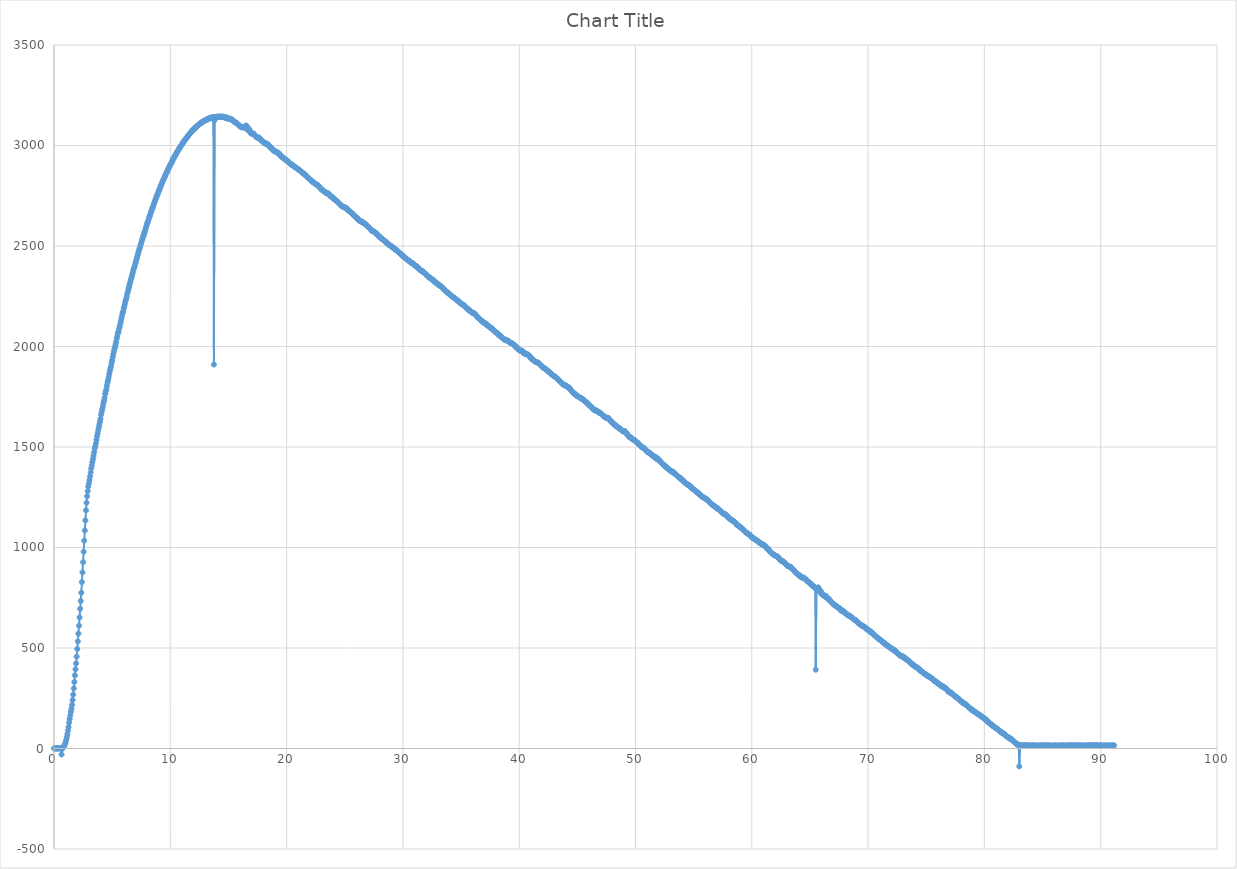
| Category | Series 0 |
|---|---|
| 0.0 | 1 |
| 0.05 | 0 |
| 0.1 | 0 |
| 0.15 | 2 |
| 0.2 | 0 |
| 0.25 | 0 |
| 0.3 | 1 |
| 0.35 | 0 |
| 0.4 | 1 |
| 0.45 | 1 |
| 0.5 | 1 |
| 0.55 | 2 |
| 0.6 | 0 |
| 0.65 | -30 |
| 0.7 | -2 |
| 0.75 | 2 |
| 0.8 | 6 |
| 0.85 | 10 |
| 0.9 | 16 |
| 0.95 | 22 |
| 1.0 | 31 |
| 1.05 | 42 |
| 1.1 | 56 |
| 1.15 | 71 |
| 1.2 | 89 |
| 1.25 | 107 |
| 1.3 | 129 |
| 1.35 | 147 |
| 1.4 | 164 |
| 1.45 | 182 |
| 1.5 | 198 |
| 1.55 | 217 |
| 1.6 | 241 |
| 1.65 | 268 |
| 1.7 | 299 |
| 1.75 | 331 |
| 1.8 | 364 |
| 1.85 | 394 |
| 1.9 | 423 |
| 1.95 | 457 |
| 2.0 | 495 |
| 2.05 | 533 |
| 2.1 | 572 |
| 2.15 | 611 |
| 2.2 | 652 |
| 2.25 | 695 |
| 2.3 | 734 |
| 2.35 | 775 |
| 2.4 | 828 |
| 2.45 | 876 |
| 2.5 | 927 |
| 2.55 | 979 |
| 2.6 | 1034 |
| 2.65 | 1085 |
| 2.7 | 1135 |
| 2.75 | 1185 |
| 2.8 | 1223 |
| 2.85 | 1255 |
| 2.9 | 1280 |
| 2.95 | 1303 |
| 3.0 | 1320 |
| 3.05 | 1336 |
| 3.1 | 1355 |
| 3.15 | 1374 |
| 3.2 | 1393 |
| 3.25 | 1409 |
| 3.3 | 1425 |
| 3.35 | 1440 |
| 3.4 | 1457 |
| 3.45 | 1474 |
| 3.5 | 1492 |
| 3.55 | 1504 |
| 3.6 | 1518 |
| 3.65 | 1535 |
| 3.7 | 1553 |
| 3.75 | 1567 |
| 3.8 | 1583 |
| 3.85 | 1597 |
| 3.9 | 1611 |
| 3.95 | 1625 |
| 4.0 | 1640 |
| 4.05 | 1660 |
| 4.1 | 1675 |
| 4.15 | 1689 |
| 4.2 | 1703 |
| 4.25 | 1719 |
| 4.3 | 1730 |
| 4.35 | 1744 |
| 4.4 | 1764 |
| 4.45 | 1777 |
| 4.5 | 1787 |
| 4.55 | 1805 |
| 4.6 | 1821 |
| 4.65 | 1833 |
| 4.7 | 1847 |
| 4.75 | 1863 |
| 4.8 | 1878 |
| 4.85 | 1891 |
| 4.9 | 1902 |
| 4.95 | 1918 |
| 5.0 | 1931 |
| 5.05 | 1947 |
| 5.1 | 1962 |
| 5.15 | 1976 |
| 5.2 | 1988 |
| 5.25 | 1998 |
| 5.3 | 2011 |
| 5.35 | 2024 |
| 5.4 | 2041 |
| 5.45 | 2053 |
| 5.5 | 2067 |
| 5.55 | 2074 |
| 5.6 | 2089 |
| 5.65 | 2100 |
| 5.7 | 2112 |
| 5.75 | 2126 |
| 5.8 | 2140 |
| 5.85 | 2154 |
| 5.9 | 2167 |
| 5.95 | 2175 |
| 6.0 | 2189 |
| 6.05 | 2200 |
| 6.1 | 2214 |
| 6.15 | 2227 |
| 6.2 | 2236 |
| 6.25 | 2248 |
| 6.3 | 2263 |
| 6.35 | 2273 |
| 6.4 | 2285 |
| 6.45 | 2296 |
| 6.5 | 2308 |
| 6.55 | 2318 |
| 6.6 | 2331 |
| 6.65 | 2341 |
| 6.7 | 2351 |
| 6.75 | 2363 |
| 6.8 | 2374 |
| 6.85 | 2385 |
| 6.9 | 2393 |
| 6.95 | 2403 |
| 7.0 | 2415 |
| 7.05 | 2424 |
| 7.1 | 2435 |
| 7.15 | 2445 |
| 7.2 | 2456 |
| 7.25 | 2467 |
| 7.3 | 2477 |
| 7.35 | 2486 |
| 7.4 | 2495 |
| 7.45 | 2505 |
| 7.5 | 2515 |
| 7.55 | 2526 |
| 7.6 | 2535 |
| 7.65 | 2545 |
| 7.7 | 2552 |
| 7.75 | 2561 |
| 7.8 | 2570 |
| 7.85 | 2580 |
| 7.9 | 2591 |
| 7.95 | 2600 |
| 8.0 | 2610 |
| 8.05 | 2618 |
| 8.1 | 2625 |
| 8.15 | 2635 |
| 8.2 | 2645 |
| 8.25 | 2651 |
| 8.3 | 2662 |
| 8.35 | 2670 |
| 8.4 | 2678 |
| 8.45 | 2687 |
| 8.5 | 2693 |
| 8.55 | 2703 |
| 8.6 | 2711 |
| 8.65 | 2719 |
| 8.7 | 2726 |
| 8.75 | 2734 |
| 8.8 | 2744 |
| 8.85 | 2750 |
| 8.9 | 2756 |
| 8.95 | 2764 |
| 9.0 | 2772 |
| 9.05 | 2779 |
| 9.1 | 2786 |
| 9.15 | 2795 |
| 9.2 | 2801 |
| 9.25 | 2808 |
| 9.3 | 2815 |
| 9.35 | 2823 |
| 9.4 | 2828 |
| 9.45 | 2835 |
| 9.5 | 2842 |
| 9.55 | 2848 |
| 9.6 | 2856 |
| 9.65 | 2861 |
| 9.7 | 2868 |
| 9.75 | 2873 |
| 9.8 | 2879 |
| 9.85 | 2886 |
| 9.9 | 2893 |
| 9.95 | 2897 |
| 10.0 | 2904 |
| 10.05 | 2908 |
| 10.1 | 2914 |
| 10.15 | 2920 |
| 10.2 | 2927 |
| 10.25 | 2933 |
| 10.3 | 2937 |
| 10.35 | 2943 |
| 10.4 | 2949 |
| 10.45 | 2953 |
| 10.5 | 2957 |
| 10.55 | 2964 |
| 10.6 | 2969 |
| 10.65 | 2973 |
| 10.7 | 2978 |
| 10.75 | 2984 |
| 10.8 | 2987 |
| 10.85 | 2992 |
| 10.9 | 2997 |
| 10.95 | 3001 |
| 11.0 | 3006 |
| 11.05 | 3009 |
| 11.1 | 3015 |
| 11.15 | 3020 |
| 11.2 | 3023 |
| 11.25 | 3026 |
| 11.3 | 3031 |
| 11.35 | 3035 |
| 11.4 | 3039 |
| 11.45 | 3041 |
| 11.5 | 3046 |
| 11.55 | 3050 |
| 11.6 | 3054 |
| 11.65 | 3057 |
| 11.7 | 3061 |
| 11.75 | 3065 |
| 11.8 | 3067 |
| 11.85 | 3070 |
| 11.9 | 3074 |
| 11.95 | 3078 |
| 12.0 | 3081 |
| 12.05 | 3081 |
| 12.1 | 3086 |
| 12.15 | 3089 |
| 12.2 | 3091 |
| 12.25 | 3094 |
| 12.3 | 3096 |
| 12.35 | 3099 |
| 12.4 | 3102 |
| 12.45 | 3103 |
| 12.5 | 3107 |
| 12.55 | 3107 |
| 12.6 | 3111 |
| 12.65 | 3114 |
| 12.7 | 3115 |
| 12.75 | 3116 |
| 12.8 | 3119 |
| 12.85 | 3120 |
| 12.9 | 3123 |
| 12.95 | 3123 |
| 13.0 | 3126 |
| 13.05 | 3127 |
| 13.1 | 3128 |
| 13.15 | 3130 |
| 13.2 | 3130 |
| 13.25 | 3132 |
| 13.3 | 3135 |
| 13.35 | 3135 |
| 13.4 | 3135 |
| 13.45 | 3138 |
| 13.5 | 3138 |
| 13.55 | 3139 |
| 13.6 | 3140 |
| 13.65 | 3139 |
| 13.7 | 3140 |
| 13.75 | 1910 |
| 13.8 | 3125 |
| 13.85 | 3142 |
| 13.9 | 3141 |
| 13.95 | 3141 |
| 14.0 | 3143 |
| 14.05 | 3143 |
| 14.1 | 3144 |
| 14.15 | 3143 |
| 14.2 | 3142 |
| 14.25 | 3142 |
| 14.3 | 3143 |
| 14.35 | 3145 |
| 14.4 | 3141 |
| 14.45 | 3142 |
| 14.5 | 3143 |
| 14.55 | 3143 |
| 14.6 | 3141 |
| 14.65 | 3140 |
| 14.7 | 3140 |
| 14.75 | 3138 |
| 14.8 | 3138 |
| 14.85 | 3140 |
| 14.9 | 3134 |
| 14.95 | 3137 |
| 15.0 | 3134 |
| 15.05 | 3133 |
| 15.1 | 3132 |
| 15.15 | 3133 |
| 15.2 | 3131 |
| 15.25 | 3131 |
| 15.3 | 3127 |
| 15.35 | 3126 |
| 15.4 | 3123 |
| 15.45 | 3121 |
| 15.5 | 3119 |
| 15.55 | 3117 |
| 15.6 | 3114 |
| 15.65 | 3114 |
| 15.7 | 3112 |
| 15.75 | 3108 |
| 15.8 | 3106 |
| 15.85 | 3103 |
| 15.9 | 3102 |
| 15.95 | 3098 |
| 16.0 | 3096 |
| 16.05 | 3094 |
| 16.1 | 3091 |
| 16.15 | 3093 |
| 16.2 | 3091 |
| 16.25 | 3091 |
| 16.3 | 3089 |
| 16.35 | 3090 |
| 16.4 | 3089 |
| 16.45 | 3094 |
| 16.5 | 3099 |
| 16.55 | 3097 |
| 16.6 | 3089 |
| 16.65 | 3077 |
| 16.7 | 3086 |
| 16.75 | 3081 |
| 16.8 | 3080 |
| 16.85 | 3069 |
| 16.9 | 3063 |
| 16.95 | 3061 |
| 17.0 | 3060 |
| 17.05 | 3057 |
| 17.1 | 3059 |
| 17.15 | 3060 |
| 17.2 | 3056 |
| 17.25 | 3052 |
| 17.3 | 3047 |
| 17.35 | 3046 |
| 17.4 | 3041 |
| 17.45 | 3040 |
| 17.5 | 3041 |
| 17.55 | 3041 |
| 17.6 | 3038 |
| 17.65 | 3036 |
| 17.7 | 3035 |
| 17.75 | 3030 |
| 17.8 | 3026 |
| 17.85 | 3024 |
| 17.9 | 3023 |
| 17.95 | 3020 |
| 18.0 | 3017 |
| 18.05 | 3014 |
| 18.1 | 3011 |
| 18.15 | 3010 |
| 18.2 | 3010 |
| 18.25 | 3010 |
| 18.3 | 3008 |
| 18.35 | 3006 |
| 18.4 | 3006 |
| 18.45 | 3002 |
| 18.5 | 2998 |
| 18.55 | 2993 |
| 18.6 | 2992 |
| 18.65 | 2988 |
| 18.7 | 2986 |
| 18.75 | 2983 |
| 18.8 | 2980 |
| 18.85 | 2976 |
| 18.9 | 2974 |
| 18.95 | 2973 |
| 19.0 | 2970 |
| 19.05 | 2969 |
| 19.1 | 2970 |
| 19.15 | 2967 |
| 19.2 | 2965 |
| 19.25 | 2963 |
| 19.3 | 2964 |
| 19.35 | 2958 |
| 19.4 | 2957 |
| 19.45 | 2951 |
| 19.5 | 2950 |
| 19.55 | 2946 |
| 19.6 | 2943 |
| 19.65 | 2940 |
| 19.7 | 2938 |
| 19.75 | 2937 |
| 19.8 | 2935 |
| 19.85 | 2932 |
| 19.9 | 2930 |
| 19.95 | 2928 |
| 20.0 | 2925 |
| 20.05 | 2924 |
| 20.1 | 2920 |
| 20.15 | 2920 |
| 20.2 | 2916 |
| 20.25 | 2912 |
| 20.3 | 2910 |
| 20.35 | 2908 |
| 20.4 | 2906 |
| 20.45 | 2903 |
| 20.5 | 2902 |
| 20.55 | 2901 |
| 20.6 | 2897 |
| 20.65 | 2896 |
| 20.7 | 2894 |
| 20.75 | 2892 |
| 20.8 | 2890 |
| 20.85 | 2888 |
| 20.9 | 2886 |
| 20.95 | 2883 |
| 21.0 | 2881 |
| 21.05 | 2880 |
| 21.1 | 2878 |
| 21.15 | 2875 |
| 21.2 | 2874 |
| 21.25 | 2870 |
| 21.3 | 2867 |
| 21.35 | 2865 |
| 21.4 | 2863 |
| 21.45 | 2861 |
| 21.5 | 2859 |
| 21.55 | 2856 |
| 21.6 | 2854 |
| 21.65 | 2850 |
| 21.7 | 2848 |
| 21.75 | 2845 |
| 21.8 | 2843 |
| 21.85 | 2839 |
| 21.9 | 2837 |
| 21.95 | 2834 |
| 22.0 | 2832 |
| 22.05 | 2829 |
| 22.1 | 2828 |
| 22.15 | 2824 |
| 22.2 | 2821 |
| 22.25 | 2818 |
| 22.3 | 2817 |
| 22.35 | 2815 |
| 22.4 | 2812 |
| 22.45 | 2811 |
| 22.5 | 2808 |
| 22.55 | 2805 |
| 22.6 | 2804 |
| 22.65 | 2804 |
| 22.7 | 2802 |
| 22.75 | 2798 |
| 22.8 | 2794 |
| 22.85 | 2791 |
| 22.9 | 2788 |
| 22.95 | 2785 |
| 23.0 | 2781 |
| 23.05 | 2779 |
| 23.1 | 2778 |
| 23.15 | 2776 |
| 23.2 | 2772 |
| 23.25 | 2771 |
| 23.3 | 2768 |
| 23.35 | 2766 |
| 23.4 | 2765 |
| 23.45 | 2763 |
| 23.5 | 2761 |
| 23.55 | 2763 |
| 23.6 | 2760 |
| 23.65 | 2758 |
| 23.7 | 2753 |
| 23.75 | 2748 |
| 23.8 | 2748 |
| 23.85 | 2746 |
| 23.9 | 2744 |
| 23.95 | 2742 |
| 24.0 | 2738 |
| 24.05 | 2737 |
| 24.1 | 2732 |
| 24.15 | 2730 |
| 24.2 | 2728 |
| 24.25 | 2727 |
| 24.3 | 2724 |
| 24.35 | 2722 |
| 24.4 | 2718 |
| 24.45 | 2714 |
| 24.5 | 2713 |
| 24.55 | 2710 |
| 24.6 | 2707 |
| 24.65 | 2703 |
| 24.7 | 2701 |
| 24.75 | 2700 |
| 24.8 | 2697 |
| 24.85 | 2695 |
| 24.9 | 2693 |
| 24.95 | 2694 |
| 25.0 | 2692 |
| 25.05 | 2691 |
| 25.1 | 2690 |
| 25.15 | 2688 |
| 25.2 | 2683 |
| 25.25 | 2681 |
| 25.3 | 2678 |
| 25.35 | 2675 |
| 25.4 | 2674 |
| 25.45 | 2672 |
| 25.5 | 2668 |
| 25.55 | 2666 |
| 25.6 | 2662 |
| 25.65 | 2662 |
| 25.7 | 2658 |
| 25.75 | 2657 |
| 25.8 | 2651 |
| 25.85 | 2648 |
| 25.9 | 2647 |
| 25.95 | 2644 |
| 26.0 | 2642 |
| 26.05 | 2641 |
| 26.1 | 2635 |
| 26.15 | 2633 |
| 26.2 | 2629 |
| 26.25 | 2628 |
| 26.3 | 2625 |
| 26.35 | 2623 |
| 26.4 | 2623 |
| 26.45 | 2620 |
| 26.5 | 2620 |
| 26.55 | 2620 |
| 26.6 | 2614 |
| 26.65 | 2613 |
| 26.7 | 2612 |
| 26.75 | 2609 |
| 26.8 | 2608 |
| 26.85 | 2606 |
| 26.9 | 2603 |
| 26.95 | 2598 |
| 27.0 | 2596 |
| 27.05 | 2594 |
| 27.1 | 2592 |
| 27.15 | 2588 |
| 27.2 | 2584 |
| 27.25 | 2582 |
| 27.3 | 2577 |
| 27.35 | 2576 |
| 27.4 | 2574 |
| 27.45 | 2574 |
| 27.5 | 2572 |
| 27.55 | 2569 |
| 27.6 | 2568 |
| 27.65 | 2566 |
| 27.7 | 2564 |
| 27.75 | 2559 |
| 27.8 | 2557 |
| 27.85 | 2553 |
| 27.9 | 2552 |
| 27.95 | 2548 |
| 28.0 | 2544 |
| 28.05 | 2544 |
| 28.1 | 2540 |
| 28.15 | 2538 |
| 28.2 | 2536 |
| 28.25 | 2533 |
| 28.3 | 2530 |
| 28.35 | 2529 |
| 28.4 | 2527 |
| 28.45 | 2525 |
| 28.5 | 2522 |
| 28.55 | 2519 |
| 28.6 | 2516 |
| 28.65 | 2514 |
| 28.7 | 2511 |
| 28.75 | 2509 |
| 28.8 | 2505 |
| 28.85 | 2505 |
| 28.9 | 2503 |
| 28.95 | 2501 |
| 29.0 | 2497 |
| 29.05 | 2498 |
| 29.1 | 2494 |
| 29.15 | 2491 |
| 29.2 | 2491 |
| 29.25 | 2489 |
| 29.3 | 2486 |
| 29.35 | 2482 |
| 29.4 | 2482 |
| 29.45 | 2478 |
| 29.5 | 2476 |
| 29.55 | 2474 |
| 29.6 | 2472 |
| 29.65 | 2469 |
| 29.7 | 2466 |
| 29.75 | 2464 |
| 29.8 | 2461 |
| 29.85 | 2459 |
| 29.9 | 2456 |
| 29.95 | 2454 |
| 30.0 | 2450 |
| 30.05 | 2449 |
| 30.1 | 2445 |
| 30.15 | 2443 |
| 30.2 | 2441 |
| 30.25 | 2438 |
| 30.3 | 2435 |
| 30.35 | 2434 |
| 30.4 | 2432 |
| 30.45 | 2429 |
| 30.5 | 2427 |
| 30.55 | 2426 |
| 30.6 | 2422 |
| 30.65 | 2419 |
| 30.7 | 2417 |
| 30.75 | 2417 |
| 30.8 | 2415 |
| 30.85 | 2415 |
| 30.9 | 2409 |
| 30.95 | 2408 |
| 31.0 | 2406 |
| 31.05 | 2403 |
| 31.1 | 2401 |
| 31.15 | 2399 |
| 31.2 | 2398 |
| 31.25 | 2393 |
| 31.3 | 2392 |
| 31.35 | 2388 |
| 31.4 | 2386 |
| 31.45 | 2382 |
| 31.5 | 2381 |
| 31.55 | 2378 |
| 31.6 | 2377 |
| 31.65 | 2375 |
| 31.7 | 2373 |
| 31.75 | 2370 |
| 31.8 | 2369 |
| 31.85 | 2365 |
| 31.9 | 2363 |
| 31.95 | 2361 |
| 32.0 | 2359 |
| 32.05 | 2355 |
| 32.1 | 2351 |
| 32.15 | 2348 |
| 32.2 | 2346 |
| 32.25 | 2346 |
| 32.3 | 2342 |
| 32.35 | 2340 |
| 32.4 | 2338 |
| 32.45 | 2336 |
| 32.5 | 2334 |
| 32.55 | 2333 |
| 32.6 | 2331 |
| 32.65 | 2325 |
| 32.7 | 2324 |
| 32.75 | 2321 |
| 32.8 | 2320 |
| 32.85 | 2318 |
| 32.9 | 2315 |
| 32.95 | 2310 |
| 33.0 | 2310 |
| 33.05 | 2309 |
| 33.1 | 2306 |
| 33.15 | 2304 |
| 33.2 | 2301 |
| 33.25 | 2300 |
| 33.3 | 2298 |
| 33.35 | 2295 |
| 33.4 | 2293 |
| 33.45 | 2289 |
| 33.5 | 2286 |
| 33.55 | 2284 |
| 33.6 | 2280 |
| 33.65 | 2278 |
| 33.7 | 2275 |
| 33.75 | 2272 |
| 33.8 | 2270 |
| 33.85 | 2267 |
| 33.9 | 2265 |
| 33.95 | 2264 |
| 34.0 | 2260 |
| 34.05 | 2258 |
| 34.1 | 2256 |
| 34.15 | 2252 |
| 34.2 | 2251 |
| 34.25 | 2249 |
| 34.3 | 2246 |
| 34.35 | 2243 |
| 34.4 | 2242 |
| 34.45 | 2241 |
| 34.5 | 2239 |
| 34.55 | 2236 |
| 34.6 | 2233 |
| 34.65 | 2230 |
| 34.7 | 2229 |
| 34.75 | 2226 |
| 34.8 | 2223 |
| 34.85 | 2222 |
| 34.9 | 2218 |
| 34.95 | 2216 |
| 35.0 | 2213 |
| 35.05 | 2211 |
| 35.1 | 2209 |
| 35.15 | 2210 |
| 35.2 | 2206 |
| 35.25 | 2205 |
| 35.3 | 2203 |
| 35.35 | 2197 |
| 35.4 | 2195 |
| 35.45 | 2193 |
| 35.5 | 2191 |
| 35.55 | 2187 |
| 35.6 | 2186 |
| 35.65 | 2184 |
| 35.7 | 2181 |
| 35.75 | 2177 |
| 35.8 | 2175 |
| 35.85 | 2173 |
| 35.9 | 2171 |
| 35.95 | 2168 |
| 36.0 | 2168 |
| 36.05 | 2166 |
| 36.1 | 2165 |
| 36.15 | 2164 |
| 36.2 | 2162 |
| 36.25 | 2157 |
| 36.3 | 2154 |
| 36.35 | 2151 |
| 36.4 | 2147 |
| 36.45 | 2144 |
| 36.5 | 2142 |
| 36.55 | 2140 |
| 36.6 | 2136 |
| 36.65 | 2134 |
| 36.7 | 2132 |
| 36.75 | 2128 |
| 36.8 | 2127 |
| 36.85 | 2123 |
| 36.9 | 2121 |
| 36.95 | 2118 |
| 37.0 | 2118 |
| 37.05 | 2116 |
| 37.1 | 2115 |
| 37.15 | 2111 |
| 37.2 | 2110 |
| 37.25 | 2105 |
| 37.3 | 2105 |
| 37.35 | 2102 |
| 37.4 | 2099 |
| 37.45 | 2099 |
| 37.5 | 2095 |
| 37.55 | 2093 |
| 37.6 | 2092 |
| 37.65 | 2089 |
| 37.7 | 2086 |
| 37.75 | 2083 |
| 37.8 | 2080 |
| 37.85 | 2077 |
| 37.9 | 2077 |
| 37.95 | 2072 |
| 38.0 | 2071 |
| 38.05 | 2069 |
| 38.1 | 2066 |
| 38.15 | 2064 |
| 38.2 | 2061 |
| 38.25 | 2058 |
| 38.3 | 2054 |
| 38.35 | 2055 |
| 38.4 | 2053 |
| 38.45 | 2048 |
| 38.5 | 2046 |
| 38.55 | 2042 |
| 38.6 | 2041 |
| 38.65 | 2038 |
| 38.7 | 2036 |
| 38.75 | 2035 |
| 38.8 | 2033 |
| 38.85 | 2031 |
| 38.9 | 2031 |
| 38.95 | 2031 |
| 39.0 | 2029 |
| 39.05 | 2026 |
| 39.1 | 2026 |
| 39.15 | 2024 |
| 39.2 | 2019 |
| 39.25 | 2018 |
| 39.3 | 2018 |
| 39.35 | 2017 |
| 39.4 | 2014 |
| 39.45 | 2012 |
| 39.5 | 2010 |
| 39.55 | 2009 |
| 39.6 | 2006 |
| 39.65 | 2001 |
| 39.7 | 1998 |
| 39.75 | 1998 |
| 39.8 | 1994 |
| 39.85 | 1992 |
| 39.9 | 1988 |
| 39.95 | 1984 |
| 40.0 | 1983 |
| 40.05 | 1981 |
| 40.1 | 1978 |
| 40.15 | 1978 |
| 40.2 | 1980 |
| 40.25 | 1979 |
| 40.3 | 1974 |
| 40.35 | 1970 |
| 40.4 | 1967 |
| 40.45 | 1965 |
| 40.5 | 1964 |
| 40.55 | 1965 |
| 40.6 | 1964 |
| 40.65 | 1962 |
| 40.7 | 1960 |
| 40.75 | 1960 |
| 40.8 | 1956 |
| 40.85 | 1954 |
| 40.9 | 1952 |
| 40.95 | 1947 |
| 41.0 | 1942 |
| 41.05 | 1940 |
| 41.1 | 1938 |
| 41.15 | 1935 |
| 41.2 | 1933 |
| 41.25 | 1931 |
| 41.3 | 1928 |
| 41.35 | 1926 |
| 41.4 | 1924 |
| 41.45 | 1923 |
| 41.5 | 1923 |
| 41.55 | 1921 |
| 41.6 | 1919 |
| 41.65 | 1918 |
| 41.7 | 1916 |
| 41.75 | 1913 |
| 41.8 | 1910 |
| 41.85 | 1907 |
| 41.9 | 1903 |
| 41.95 | 1902 |
| 42.0 | 1899 |
| 42.05 | 1895 |
| 42.1 | 1894 |
| 42.15 | 1893 |
| 42.2 | 1891 |
| 42.25 | 1889 |
| 42.3 | 1887 |
| 42.35 | 1884 |
| 42.4 | 1882 |
| 42.45 | 1879 |
| 42.5 | 1877 |
| 42.55 | 1874 |
| 42.6 | 1872 |
| 42.65 | 1870 |
| 42.7 | 1866 |
| 42.75 | 1863 |
| 42.8 | 1861 |
| 42.85 | 1858 |
| 42.9 | 1856 |
| 42.95 | 1853 |
| 43.0 | 1853 |
| 43.05 | 1851 |
| 43.1 | 1849 |
| 43.15 | 1847 |
| 43.2 | 1844 |
| 43.25 | 1842 |
| 43.3 | 1839 |
| 43.35 | 1835 |
| 43.4 | 1832 |
| 43.45 | 1830 |
| 43.5 | 1828 |
| 43.55 | 1823 |
| 43.6 | 1822 |
| 43.65 | 1818 |
| 43.7 | 1814 |
| 43.75 | 1814 |
| 43.8 | 1811 |
| 43.85 | 1809 |
| 43.9 | 1808 |
| 43.95 | 1806 |
| 44.0 | 1805 |
| 44.05 | 1805 |
| 44.1 | 1801 |
| 44.15 | 1800 |
| 44.2 | 1798 |
| 44.25 | 1795 |
| 44.3 | 1794 |
| 44.35 | 1792 |
| 44.4 | 1787 |
| 44.45 | 1782 |
| 44.5 | 1779 |
| 44.55 | 1776 |
| 44.6 | 1773 |
| 44.65 | 1771 |
| 44.7 | 1768 |
| 44.75 | 1766 |
| 44.8 | 1763 |
| 44.85 | 1761 |
| 44.9 | 1757 |
| 44.95 | 1755 |
| 45.0 | 1755 |
| 45.05 | 1752 |
| 45.1 | 1750 |
| 45.15 | 1748 |
| 45.2 | 1747 |
| 45.25 | 1744 |
| 45.3 | 1742 |
| 45.35 | 1743 |
| 45.4 | 1738 |
| 45.45 | 1737 |
| 45.5 | 1736 |
| 45.55 | 1735 |
| 45.6 | 1730 |
| 45.65 | 1727 |
| 45.7 | 1725 |
| 45.75 | 1724 |
| 45.8 | 1720 |
| 45.85 | 1718 |
| 45.9 | 1716 |
| 45.95 | 1712 |
| 46.0 | 1709 |
| 46.05 | 1707 |
| 46.1 | 1704 |
| 46.15 | 1702 |
| 46.2 | 1698 |
| 46.25 | 1696 |
| 46.3 | 1692 |
| 46.35 | 1690 |
| 46.4 | 1686 |
| 46.45 | 1685 |
| 46.5 | 1683 |
| 46.55 | 1682 |
| 46.6 | 1681 |
| 46.65 | 1681 |
| 46.7 | 1679 |
| 46.75 | 1677 |
| 46.8 | 1674 |
| 46.85 | 1671 |
| 46.9 | 1672 |
| 46.95 | 1669 |
| 47.0 | 1667 |
| 47.05 | 1666 |
| 47.1 | 1663 |
| 47.15 | 1659 |
| 47.2 | 1657 |
| 47.25 | 1655 |
| 47.3 | 1652 |
| 47.35 | 1651 |
| 47.4 | 1647 |
| 47.45 | 1647 |
| 47.5 | 1644 |
| 47.55 | 1644 |
| 47.6 | 1645 |
| 47.65 | 1645 |
| 47.7 | 1641 |
| 47.75 | 1636 |
| 47.8 | 1635 |
| 47.85 | 1630 |
| 47.9 | 1627 |
| 47.95 | 1625 |
| 48.0 | 1622 |
| 48.05 | 1620 |
| 48.1 | 1617 |
| 48.15 | 1613 |
| 48.2 | 1611 |
| 48.25 | 1609 |
| 48.3 | 1606 |
| 48.35 | 1605 |
| 48.4 | 1601 |
| 48.45 | 1599 |
| 48.5 | 1597 |
| 48.55 | 1596 |
| 48.6 | 1594 |
| 48.65 | 1590 |
| 48.7 | 1590 |
| 48.75 | 1587 |
| 48.8 | 1584 |
| 48.85 | 1581 |
| 48.9 | 1578 |
| 48.95 | 1579 |
| 49.0 | 1578 |
| 49.05 | 1579 |
| 49.1 | 1578 |
| 49.15 | 1572 |
| 49.2 | 1570 |
| 49.25 | 1566 |
| 49.3 | 1563 |
| 49.35 | 1558 |
| 49.4 | 1555 |
| 49.45 | 1550 |
| 49.5 | 1550 |
| 49.55 | 1549 |
| 49.6 | 1546 |
| 49.65 | 1544 |
| 49.7 | 1541 |
| 49.75 | 1538 |
| 49.8 | 1537 |
| 49.85 | 1536 |
| 49.9 | 1535 |
| 49.95 | 1533 |
| 50.0 | 1529 |
| 50.05 | 1525 |
| 50.1 | 1524 |
| 50.15 | 1523 |
| 50.2 | 1520 |
| 50.25 | 1518 |
| 50.3 | 1513 |
| 50.35 | 1511 |
| 50.4 | 1507 |
| 50.45 | 1504 |
| 50.5 | 1501 |
| 50.55 | 1499 |
| 50.6 | 1498 |
| 50.65 | 1498 |
| 50.7 | 1496 |
| 50.75 | 1492 |
| 50.8 | 1491 |
| 50.85 | 1487 |
| 50.9 | 1484 |
| 50.95 | 1480 |
| 51.0 | 1476 |
| 51.05 | 1474 |
| 51.1 | 1474 |
| 51.15 | 1474 |
| 51.2 | 1470 |
| 51.25 | 1469 |
| 51.3 | 1466 |
| 51.35 | 1463 |
| 51.4 | 1461 |
| 51.45 | 1460 |
| 51.5 | 1456 |
| 51.55 | 1453 |
| 51.6 | 1451 |
| 51.65 | 1451 |
| 51.7 | 1450 |
| 51.75 | 1449 |
| 51.8 | 1441 |
| 51.85 | 1443 |
| 51.9 | 1444 |
| 51.95 | 1439 |
| 52.0 | 1435 |
| 52.05 | 1433 |
| 52.1 | 1431 |
| 52.15 | 1426 |
| 52.2 | 1424 |
| 52.25 | 1420 |
| 52.3 | 1417 |
| 52.35 | 1414 |
| 52.4 | 1413 |
| 52.45 | 1410 |
| 52.5 | 1407 |
| 52.55 | 1404 |
| 52.6 | 1402 |
| 52.65 | 1400 |
| 52.7 | 1397 |
| 52.75 | 1393 |
| 52.8 | 1393 |
| 52.85 | 1389 |
| 52.9 | 1387 |
| 52.95 | 1384 |
| 53.0 | 1383 |
| 53.05 | 1381 |
| 53.1 | 1377 |
| 53.15 | 1378 |
| 53.2 | 1374 |
| 53.25 | 1376 |
| 53.3 | 1370 |
| 53.35 | 1370 |
| 53.4 | 1367 |
| 53.45 | 1364 |
| 53.5 | 1361 |
| 53.55 | 1359 |
| 53.6 | 1356 |
| 53.65 | 1353 |
| 53.7 | 1351 |
| 53.75 | 1350 |
| 53.8 | 1346 |
| 53.85 | 1345 |
| 53.9 | 1344 |
| 53.95 | 1339 |
| 54.0 | 1335 |
| 54.05 | 1335 |
| 54.1 | 1334 |
| 54.15 | 1328 |
| 54.2 | 1326 |
| 54.25 | 1323 |
| 54.3 | 1320 |
| 54.35 | 1319 |
| 54.4 | 1316 |
| 54.45 | 1314 |
| 54.5 | 1312 |
| 54.55 | 1311 |
| 54.6 | 1308 |
| 54.65 | 1309 |
| 54.7 | 1303 |
| 54.75 | 1302 |
| 54.8 | 1299 |
| 54.85 | 1294 |
| 54.9 | 1294 |
| 54.95 | 1290 |
| 55.0 | 1289 |
| 55.05 | 1286 |
| 55.1 | 1285 |
| 55.15 | 1283 |
| 55.2 | 1278 |
| 55.25 | 1278 |
| 55.3 | 1275 |
| 55.35 | 1272 |
| 55.4 | 1271 |
| 55.45 | 1268 |
| 55.5 | 1264 |
| 55.55 | 1262 |
| 55.6 | 1261 |
| 55.65 | 1256 |
| 55.7 | 1254 |
| 55.75 | 1252 |
| 55.8 | 1251 |
| 55.85 | 1249 |
| 55.9 | 1247 |
| 55.95 | 1247 |
| 56.0 | 1244 |
| 56.05 | 1242 |
| 56.1 | 1240 |
| 56.15 | 1239 |
| 56.2 | 1234 |
| 56.25 | 1233 |
| 56.3 | 1230 |
| 56.35 | 1227 |
| 56.4 | 1224 |
| 56.45 | 1220 |
| 56.5 | 1218 |
| 56.55 | 1216 |
| 56.6 | 1213 |
| 56.65 | 1211 |
| 56.7 | 1210 |
| 56.75 | 1206 |
| 56.8 | 1205 |
| 56.85 | 1202 |
| 56.9 | 1200 |
| 56.95 | 1198 |
| 57.0 | 1195 |
| 57.05 | 1195 |
| 57.1 | 1191 |
| 57.15 | 1190 |
| 57.2 | 1187 |
| 57.25 | 1185 |
| 57.3 | 1183 |
| 57.35 | 1178 |
| 57.4 | 1177 |
| 57.45 | 1173 |
| 57.5 | 1170 |
| 57.55 | 1170 |
| 57.6 | 1166 |
| 57.65 | 1167 |
| 57.7 | 1166 |
| 57.75 | 1164 |
| 57.8 | 1161 |
| 57.85 | 1157 |
| 57.9 | 1155 |
| 57.95 | 1152 |
| 58.0 | 1148 |
| 58.05 | 1147 |
| 58.1 | 1143 |
| 58.15 | 1141 |
| 58.2 | 1140 |
| 58.25 | 1138 |
| 58.3 | 1135 |
| 58.35 | 1134 |
| 58.4 | 1131 |
| 58.45 | 1130 |
| 58.5 | 1128 |
| 58.55 | 1125 |
| 58.6 | 1123 |
| 58.65 | 1117 |
| 58.7 | 1114 |
| 58.75 | 1112 |
| 58.8 | 1110 |
| 58.85 | 1109 |
| 58.9 | 1107 |
| 58.95 | 1103 |
| 59.0 | 1101 |
| 59.05 | 1098 |
| 59.1 | 1098 |
| 59.15 | 1095 |
| 59.2 | 1092 |
| 59.25 | 1090 |
| 59.3 | 1086 |
| 59.35 | 1085 |
| 59.4 | 1081 |
| 59.45 | 1078 |
| 59.5 | 1075 |
| 59.55 | 1073 |
| 59.6 | 1071 |
| 59.65 | 1069 |
| 59.7 | 1067 |
| 59.75 | 1066 |
| 59.8 | 1063 |
| 59.85 | 1062 |
| 59.9 | 1057 |
| 59.95 | 1054 |
| 60.0 | 1052 |
| 60.05 | 1049 |
| 60.1 | 1048 |
| 60.15 | 1045 |
| 60.2 | 1044 |
| 60.25 | 1042 |
| 60.3 | 1040 |
| 60.35 | 1037 |
| 60.4 | 1036 |
| 60.45 | 1033 |
| 60.5 | 1032 |
| 60.55 | 1031 |
| 60.6 | 1026 |
| 60.65 | 1025 |
| 60.7 | 1022 |
| 60.75 | 1022 |
| 60.8 | 1018 |
| 60.85 | 1018 |
| 60.9 | 1015 |
| 60.95 | 1014 |
| 61.0 | 1013 |
| 61.05 | 1010 |
| 61.1 | 1010 |
| 61.15 | 1006 |
| 61.2 | 1004 |
| 61.25 | 1000 |
| 61.3 | 995 |
| 61.35 | 994 |
| 61.4 | 992 |
| 61.45 | 991 |
| 61.5 | 984 |
| 61.55 | 981 |
| 61.6 | 979 |
| 61.65 | 975 |
| 61.7 | 973 |
| 61.75 | 970 |
| 61.8 | 967 |
| 61.85 | 966 |
| 61.9 | 964 |
| 61.95 | 963 |
| 62.0 | 960 |
| 62.05 | 958 |
| 62.1 | 958 |
| 62.15 | 957 |
| 62.2 | 953 |
| 62.25 | 951 |
| 62.3 | 951 |
| 62.35 | 945 |
| 62.4 | 940 |
| 62.45 | 940 |
| 62.5 | 936 |
| 62.55 | 933 |
| 62.6 | 932 |
| 62.65 | 931 |
| 62.7 | 931 |
| 62.75 | 928 |
| 62.8 | 924 |
| 62.85 | 923 |
| 62.9 | 918 |
| 62.95 | 916 |
| 63.0 | 913 |
| 63.05 | 910 |
| 63.1 | 908 |
| 63.15 | 907 |
| 63.2 | 905 |
| 63.25 | 905 |
| 63.3 | 903 |
| 63.35 | 902 |
| 63.4 | 901 |
| 63.45 | 896 |
| 63.5 | 892 |
| 63.55 | 891 |
| 63.6 | 886 |
| 63.65 | 885 |
| 63.7 | 880 |
| 63.75 | 877 |
| 63.8 | 874 |
| 63.85 | 872 |
| 63.9 | 869 |
| 63.95 | 867 |
| 64.0 | 865 |
| 64.05 | 864 |
| 64.1 | 860 |
| 64.15 | 857 |
| 64.2 | 856 |
| 64.25 | 853 |
| 64.3 | 851 |
| 64.35 | 849 |
| 64.4 | 850 |
| 64.45 | 850 |
| 64.5 | 848 |
| 64.55 | 845 |
| 64.6 | 843 |
| 64.65 | 841 |
| 64.7 | 839 |
| 64.75 | 833 |
| 64.8 | 831 |
| 64.85 | 830 |
| 64.9 | 829 |
| 64.95 | 824 |
| 65.0 | 823 |
| 65.05 | 820 |
| 65.1 | 818 |
| 65.15 | 814 |
| 65.2 | 812 |
| 65.25 | 809 |
| 65.3 | 807 |
| 65.35 | 805 |
| 65.4 | 801 |
| 65.45 | 800 |
| 65.5 | 392 |
| 65.55 | 792 |
| 65.6 | 790 |
| 65.65 | 789 |
| 65.7 | 802 |
| 65.75 | 797 |
| 65.8 | 792 |
| 65.85 | 779 |
| 65.9 | 783 |
| 65.95 | 780 |
| 66.0 | 769 |
| 66.05 | 768 |
| 66.1 | 766 |
| 66.15 | 762 |
| 66.2 | 761 |
| 66.25 | 760 |
| 66.3 | 756 |
| 66.35 | 755 |
| 66.4 | 758 |
| 66.45 | 752 |
| 66.5 | 747 |
| 66.55 | 744 |
| 66.6 | 744 |
| 66.65 | 743 |
| 66.7 | 736 |
| 66.75 | 734 |
| 66.8 | 731 |
| 66.85 | 728 |
| 66.9 | 725 |
| 66.95 | 722 |
| 67.0 | 719 |
| 67.05 | 716 |
| 67.1 | 714 |
| 67.15 | 714 |
| 67.2 | 710 |
| 67.25 | 708 |
| 67.3 | 707 |
| 67.35 | 704 |
| 67.4 | 701 |
| 67.45 | 701 |
| 67.5 | 699 |
| 67.55 | 696 |
| 67.6 | 694 |
| 67.65 | 688 |
| 67.7 | 687 |
| 67.75 | 685 |
| 67.8 | 687 |
| 67.85 | 682 |
| 67.9 | 681 |
| 67.95 | 678 |
| 68.0 | 676 |
| 68.05 | 673 |
| 68.1 | 670 |
| 68.15 | 669 |
| 68.2 | 667 |
| 68.25 | 663 |
| 68.3 | 663 |
| 68.35 | 661 |
| 68.4 | 660 |
| 68.45 | 659 |
| 68.5 | 655 |
| 68.55 | 653 |
| 68.6 | 652 |
| 68.65 | 649 |
| 68.7 | 647 |
| 68.75 | 644 |
| 68.8 | 642 |
| 68.85 | 640 |
| 68.9 | 639 |
| 68.95 | 636 |
| 69.0 | 635 |
| 69.05 | 632 |
| 69.1 | 627 |
| 69.15 | 625 |
| 69.2 | 623 |
| 69.25 | 620 |
| 69.3 | 617 |
| 69.35 | 616 |
| 69.4 | 614 |
| 69.45 | 613 |
| 69.5 | 610 |
| 69.55 | 610 |
| 69.6 | 607 |
| 69.65 | 605 |
| 69.7 | 603 |
| 69.75 | 601 |
| 69.8 | 601 |
| 69.85 | 596 |
| 69.9 | 595 |
| 69.95 | 591 |
| 70.0 | 590 |
| 70.05 | 587 |
| 70.1 | 585 |
| 70.15 | 582 |
| 70.2 | 583 |
| 70.25 | 579 |
| 70.3 | 576 |
| 70.35 | 575 |
| 70.4 | 573 |
| 70.45 | 569 |
| 70.5 | 566 |
| 70.55 | 563 |
| 70.6 | 561 |
| 70.65 | 559 |
| 70.7 | 555 |
| 70.75 | 554 |
| 70.8 | 552 |
| 70.85 | 549 |
| 70.9 | 545 |
| 70.95 | 544 |
| 71.0 | 542 |
| 71.05 | 540 |
| 71.1 | 538 |
| 71.15 | 536 |
| 71.2 | 532 |
| 71.25 | 530 |
| 71.3 | 529 |
| 71.35 | 526 |
| 71.4 | 524 |
| 71.45 | 522 |
| 71.5 | 517 |
| 71.55 | 515 |
| 71.6 | 515 |
| 71.65 | 513 |
| 71.7 | 511 |
| 71.75 | 508 |
| 71.8 | 506 |
| 71.85 | 503 |
| 71.9 | 502 |
| 71.95 | 500 |
| 72.0 | 499 |
| 72.05 | 494 |
| 72.1 | 495 |
| 72.15 | 493 |
| 72.2 | 488 |
| 72.25 | 490 |
| 72.3 | 486 |
| 72.35 | 484 |
| 72.4 | 481 |
| 72.45 | 477 |
| 72.5 | 476 |
| 72.55 | 473 |
| 72.6 | 471 |
| 72.65 | 468 |
| 72.7 | 464 |
| 72.75 | 464 |
| 72.8 | 462 |
| 72.85 | 460 |
| 72.9 | 459 |
| 72.95 | 457 |
| 73.0 | 458 |
| 73.05 | 453 |
| 73.1 | 450 |
| 73.15 | 452 |
| 73.2 | 449 |
| 73.25 | 445 |
| 73.3 | 444 |
| 73.35 | 440 |
| 73.4 | 440 |
| 73.45 | 437 |
| 73.5 | 436 |
| 73.55 | 433 |
| 73.6 | 428 |
| 73.65 | 425 |
| 73.7 | 425 |
| 73.75 | 419 |
| 73.8 | 419 |
| 73.85 | 417 |
| 73.9 | 415 |
| 73.95 | 413 |
| 74.0 | 408 |
| 74.05 | 408 |
| 74.1 | 406 |
| 74.15 | 406 |
| 74.2 | 403 |
| 74.25 | 401 |
| 74.3 | 397 |
| 74.35 | 398 |
| 74.4 | 392 |
| 74.45 | 391 |
| 74.5 | 388 |
| 74.55 | 385 |
| 74.6 | 384 |
| 74.65 | 381 |
| 74.7 | 378 |
| 74.75 | 377 |
| 74.8 | 374 |
| 74.85 | 371 |
| 74.9 | 370 |
| 74.95 | 368 |
| 75.0 | 368 |
| 75.05 | 364 |
| 75.1 | 360 |
| 75.15 | 362 |
| 75.2 | 359 |
| 75.25 | 357 |
| 75.3 | 354 |
| 75.35 | 354 |
| 75.4 | 352 |
| 75.45 | 350 |
| 75.5 | 349 |
| 75.55 | 346 |
| 75.6 | 342 |
| 75.65 | 338 |
| 75.7 | 338 |
| 75.75 | 336 |
| 75.8 | 333 |
| 75.85 | 330 |
| 75.9 | 329 |
| 75.95 | 328 |
| 76.0 | 323 |
| 76.05 | 323 |
| 76.1 | 321 |
| 76.15 | 319 |
| 76.2 | 315 |
| 76.25 | 312 |
| 76.3 | 312 |
| 76.35 | 312 |
| 76.4 | 308 |
| 76.45 | 306 |
| 76.5 | 308 |
| 76.55 | 301 |
| 76.6 | 300 |
| 76.65 | 299 |
| 76.7 | 299 |
| 76.75 | 295 |
| 76.8 | 292 |
| 76.85 | 288 |
| 76.9 | 284 |
| 76.95 | 281 |
| 77.0 | 279 |
| 77.05 | 279 |
| 77.1 | 278 |
| 77.15 | 277 |
| 77.2 | 273 |
| 77.25 | 270 |
| 77.3 | 269 |
| 77.35 | 267 |
| 77.4 | 263 |
| 77.45 | 260 |
| 77.5 | 260 |
| 77.55 | 256 |
| 77.6 | 254 |
| 77.65 | 253 |
| 77.7 | 249 |
| 77.75 | 249 |
| 77.8 | 246 |
| 77.85 | 242 |
| 77.9 | 239 |
| 77.95 | 236 |
| 78.0 | 235 |
| 78.05 | 233 |
| 78.1 | 229 |
| 78.15 | 229 |
| 78.2 | 225 |
| 78.25 | 225 |
| 78.3 | 222 |
| 78.35 | 221 |
| 78.4 | 219 |
| 78.45 | 216 |
| 78.5 | 214 |
| 78.55 | 212 |
| 78.6 | 208 |
| 78.65 | 206 |
| 78.7 | 202 |
| 78.75 | 201 |
| 78.8 | 199 |
| 78.85 | 197 |
| 78.9 | 193 |
| 78.95 | 192 |
| 79.0 | 188 |
| 79.05 | 186 |
| 79.1 | 185 |
| 79.15 | 184 |
| 79.2 | 182 |
| 79.25 | 180 |
| 79.3 | 177 |
| 79.35 | 175 |
| 79.4 | 173 |
| 79.45 | 172 |
| 79.5 | 169 |
| 79.55 | 167 |
| 79.6 | 167 |
| 79.65 | 164 |
| 79.7 | 162 |
| 79.75 | 158 |
| 79.8 | 157 |
| 79.85 | 155 |
| 79.9 | 153 |
| 79.95 | 151 |
| 80.0 | 149 |
| 80.05 | 148 |
| 80.1 | 145 |
| 80.15 | 142 |
| 80.2 | 138 |
| 80.25 | 136 |
| 80.3 | 132 |
| 80.35 | 131 |
| 80.4 | 129 |
| 80.45 | 125 |
| 80.5 | 123 |
| 80.55 | 120 |
| 80.6 | 120 |
| 80.65 | 117 |
| 80.7 | 113 |
| 80.75 | 111 |
| 80.8 | 110 |
| 80.85 | 108 |
| 80.9 | 106 |
| 80.95 | 102 |
| 81.0 | 101 |
| 81.05 | 99 |
| 81.1 | 98 |
| 81.15 | 97 |
| 81.2 | 93 |
| 81.25 | 90 |
| 81.3 | 87 |
| 81.35 | 86 |
| 81.4 | 82 |
| 81.45 | 82 |
| 81.5 | 78 |
| 81.55 | 77 |
| 81.6 | 76 |
| 81.65 | 74 |
| 81.7 | 72 |
| 81.75 | 69 |
| 81.8 | 67 |
| 81.85 | 63 |
| 81.9 | 61 |
| 81.95 | 59 |
| 82.0 | 57 |
| 82.05 | 56 |
| 82.1 | 54 |
| 82.15 | 51 |
| 82.2 | 48 |
| 82.25 | 49 |
| 82.3 | 48 |
| 82.35 | 44 |
| 82.4 | 41 |
| 82.45 | 40 |
| 82.5 | 37 |
| 82.55 | 34 |
| 82.6 | 33 |
| 82.65 | 28 |
| 82.7 | 26 |
| 82.75 | 23 |
| 82.8 | 21 |
| 82.85 | 19 |
| 82.9 | 19 |
| 82.95 | 19 |
| 83.0 | -89 |
| 83.05 | 15 |
| 83.1 | 16 |
| 83.15 | 15 |
| 83.2 | 16 |
| 83.25 | 13 |
| 83.3 | 12 |
| 83.35 | 14 |
| 83.4 | 16 |
| 83.45 | 15 |
| 83.5 | 15 |
| 83.55 | 17 |
| 83.6 | 16 |
| 83.65 | 15 |
| 83.7 | 14 |
| 83.75 | 14 |
| 83.8 | 14 |
| 83.85 | 14 |
| 83.9 | 14 |
| 83.95 | 15 |
| 84.0 | 14 |
| 84.05 | 13 |
| 84.1 | 15 |
| 84.15 | 15 |
| 84.2 | 15 |
| 84.25 | 14 |
| 84.3 | 14 |
| 84.35 | 14 |
| 84.4 | 14 |
| 84.45 | 14 |
| 84.5 | 14 |
| 84.55 | 14 |
| 84.6 | 13 |
| 84.65 | 14 |
| 84.7 | 14 |
| 84.75 | 15 |
| 84.8 | 13 |
| 84.85 | 15 |
| 84.9 | 15 |
| 84.95 | 14 |
| 85.0 | 15 |
| 85.05 | 15 |
| 85.1 | 14 |
| 85.15 | 14 |
| 85.2 | 14 |
| 85.25 | 14 |
| 85.3 | 15 |
| 85.35 | 15 |
| 85.4 | 14 |
| 85.45 | 15 |
| 85.5 | 15 |
| 85.55 | 14 |
| 85.6 | 13 |
| 85.65 | 14 |
| 85.7 | 14 |
| 85.75 | 13 |
| 85.8 | 14 |
| 85.85 | 14 |
| 85.9 | 14 |
| 85.95 | 14 |
| 86.0 | 14 |
| 86.05 | 15 |
| 86.1 | 14 |
| 86.15 | 14 |
| 86.2 | 14 |
| 86.25 | 15 |
| 86.3 | 13 |
| 86.35 | 13 |
| 86.4 | 14 |
| 86.45 | 14 |
| 86.5 | 15 |
| 86.55 | 14 |
| 86.6 | 14 |
| 86.65 | 15 |
| 86.7 | 15 |
| 86.75 | 15 |
| 86.8 | 14 |
| 86.85 | 15 |
| 86.9 | 15 |
| 86.95 | 13 |
| 87.0 | 14 |
| 87.05 | 15 |
| 87.1 | 13 |
| 87.15 | 14 |
| 87.2 | 15 |
| 87.25 | 14 |
| 87.3 | 14 |
| 87.35 | 14 |
| 87.4 | 16 |
| 87.45 | 15 |
| 87.5 | 14 |
| 87.55 | 14 |
| 87.6 | 15 |
| 87.65 | 15 |
| 87.7 | 14 |
| 87.75 | 15 |
| 87.8 | 14 |
| 87.85 | 14 |
| 87.9 | 14 |
| 87.95 | 14 |
| 88.0 | 15 |
| 88.05 | 15 |
| 88.1 | 14 |
| 88.15 | 16 |
| 88.2 | 14 |
| 88.25 | 14 |
| 88.3 | 14 |
| 88.35 | 15 |
| 88.4 | 14 |
| 88.45 | 14 |
| 88.5 | 15 |
| 88.55 | 14 |
| 88.6 | 14 |
| 88.65 | 14 |
| 88.7 | 13 |
| 88.75 | 14 |
| 88.8 | 15 |
| 88.85 | 15 |
| 88.9 | 15 |
| 88.95 | 15 |
| 89.0 | 15 |
| 89.05 | 15 |
| 89.1 | 13 |
| 89.15 | 15 |
| 89.2 | 15 |
| 89.25 | 14 |
| 89.3 | 15 |
| 89.35 | 15 |
| 89.4 | 15 |
| 89.45 | 15 |
| 89.5 | 13 |
| 89.55 | 15 |
| 89.6 | 15 |
| 89.65 | 16 |
| 89.7 | 15 |
| 89.75 | 14 |
| 89.8 | 15 |
| 89.85 | 14 |
| 89.9 | 15 |
| 89.95 | 15 |
| 90.0 | 15 |
| 90.05 | 14 |
| 90.1 | 15 |
| 90.15 | 14 |
| 90.2 | 13 |
| 90.25 | 14 |
| 90.3 | 15 |
| 90.35 | 13 |
| 90.4 | 14 |
| 90.45 | 15 |
| 90.5 | 14 |
| 90.55 | 14 |
| 90.6 | 14 |
| 90.65 | 14 |
| 90.7 | 15 |
| 90.75 | 14 |
| 90.8 | 15 |
| 90.85 | 14 |
| 90.9 | 15 |
| 90.95 | 14 |
| 91.0 | 15 |
| 91.05 | 14 |
| 91.1 | 14 |
| 91.15 | 16 |